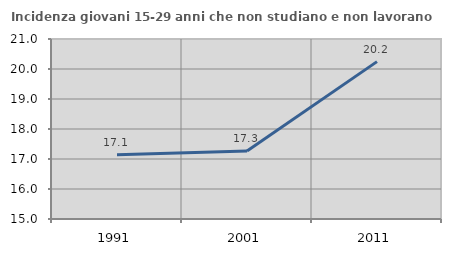
| Category | Incidenza giovani 15-29 anni che non studiano e non lavorano  |
|---|---|
| 1991.0 | 17.139 |
| 2001.0 | 17.266 |
| 2011.0 | 20.245 |